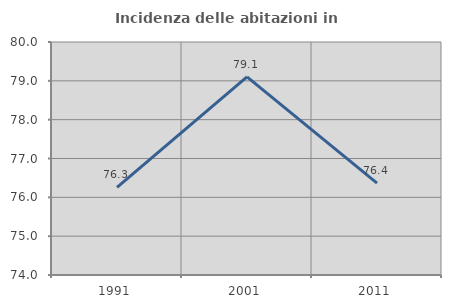
| Category | Incidenza delle abitazioni in proprietà  |
|---|---|
| 1991.0 | 76.254 |
| 2001.0 | 79.1 |
| 2011.0 | 76.364 |